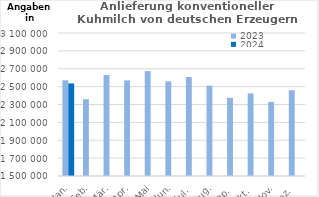
| Category | 2023 | 2024 |
|---|---|---|
| Jan. | 2570743.143 | 2536011.63 |
| Feb. | 2359059.742 | 0 |
| Mär. | 2630869.13 | 0 |
| Apr. | 2569719.993 | 0 |
| Mai | 2673701.468 | 0 |
| Jun. | 2558684.011 | 0 |
| Jul. | 2607456.281 | 0 |
| Aug. | 2510801.285 | 0 |
| Sep. | 2374850.095 | 0 |
| Okt. | 2424212.752 | 0 |
| Nov. | 2329403.846 | 0 |
| Dez. | 2459158.484 | 0 |